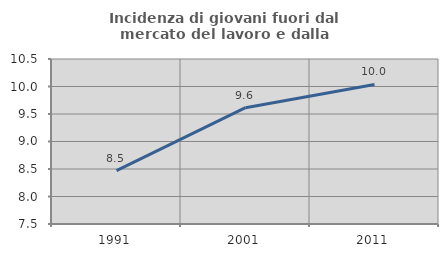
| Category | Incidenza di giovani fuori dal mercato del lavoro e dalla formazione  |
|---|---|
| 1991.0 | 8.471 |
| 2001.0 | 9.615 |
| 2011.0 | 10.038 |